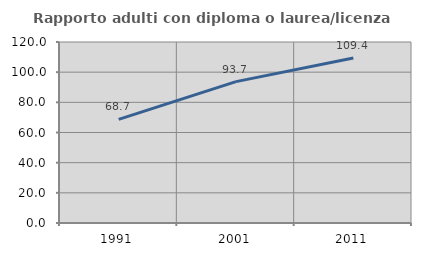
| Category | Rapporto adulti con diploma o laurea/licenza media  |
|---|---|
| 1991.0 | 68.713 |
| 2001.0 | 93.735 |
| 2011.0 | 109.409 |